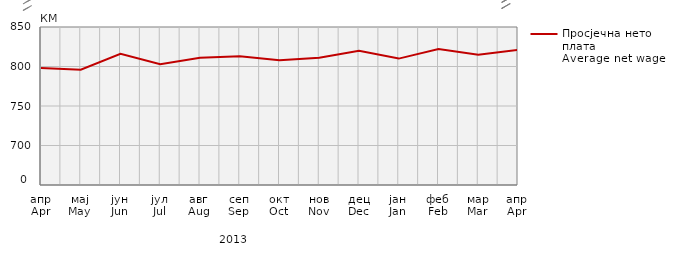
| Category | Просјечна нето плата
Average net wage |
|---|---|
| апр
Apr | 798 |
| мај
May | 796 |
| јун
Jun | 816 |
| јул
Jul | 803 |
| авг
Aug | 811 |
| сеп
Sep | 813 |
| окт
Oct | 808 |
| нов
Nov | 811 |
| дец
Dec | 820 |
| јан
Jan | 810 |
| феб
Feb | 822 |
| мар
Mar | 815 |
| апр
Apr | 821 |